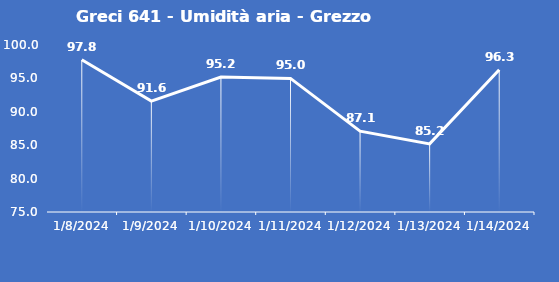
| Category | Greci 641 - Umidità aria - Grezzo (%) |
|---|---|
| 1/8/24 | 97.8 |
| 1/9/24 | 91.6 |
| 1/10/24 | 95.2 |
| 1/11/24 | 95 |
| 1/12/24 | 87.1 |
| 1/13/24 | 85.2 |
| 1/14/24 | 96.3 |